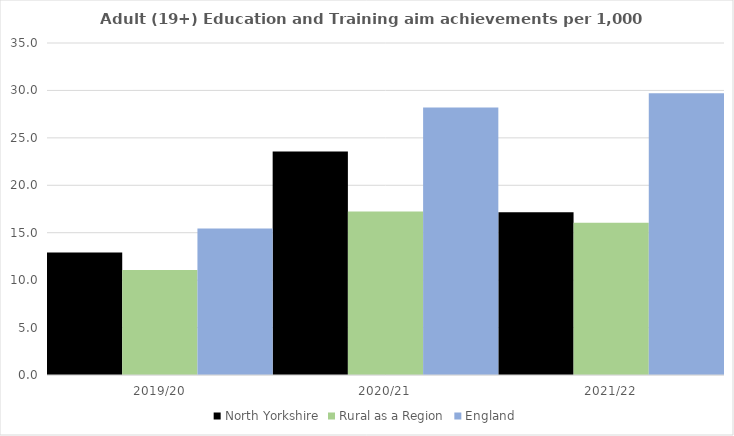
| Category | North Yorkshire | Rural as a Region | England |
|---|---|---|---|
| 2019/20 | 12.912 | 11.081 | 15.446 |
| 2020/21 | 23.56 | 17.224 | 28.211 |
| 2021/22 | 17.165 | 16.063 | 29.711 |